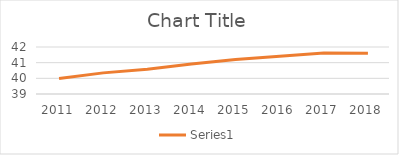
| Category | Series 1 |
|---|---|
| 2011.0 | 39.987 |
| 2012.0 | 40.349 |
| 2013.0 | 40.581 |
| 2014.0 | 40.92 |
| 2015.0 | 41.202 |
| 2016.0 | 41.407 |
| 2017.0 | 41.617 |
| 2018.0 | 41.595 |